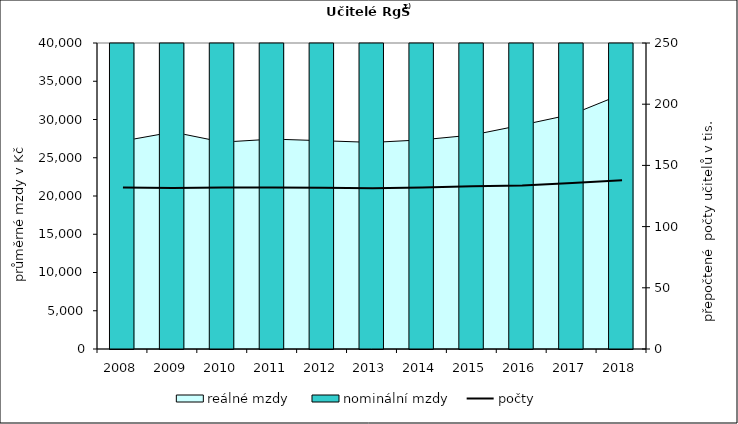
| Category | nominální mzdy |
|---|---|
| 2008.0 | 24661.298 |
| 2009.0 | 26006.026 |
| 2010.0 | 25150.829 |
| 2011.0 | 26011.553 |
| 2012.0 | 26654.329 |
| 2013.0 | 26815.833 |
| 2014.0 | 27261.213 |
| 2015.0 | 27969.265 |
| 2016.0 | 29487.404 |
| 2017.0 | 31631.64 |
| 2018.0 | 35088.9 |